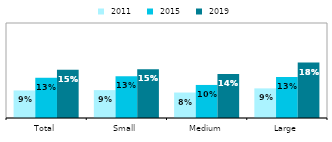
| Category |  2011 |  2015 |  2019 |
|---|---|---|---|
| Total | 0.087 | 0.127 | 0.152 |
| Small | 0.088 | 0.132 | 0.154 |
| Medium | 0.08 | 0.104 | 0.139 |
| Large | 0.094 | 0.13 | 0.175 |